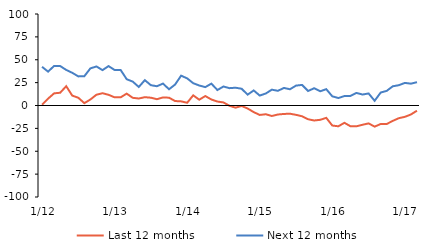
| Category | Last 12 months | Next 12 months |
|---|---|---|
|  1/12 | 0.85 | 42.3 |
|  2/12 | 7.49 | 37.02 |
|  3/12 | 13.29 | 43.26 |
|  4/12 | 13.96 | 43.14 |
|  5/12 | 21.08 | 38.87 |
|  6/12 | 10.81 | 35.74 |
|  7/12 | 8.46 | 31.81 |
|  8/12 | 2.55 | 32.03 |
|  9/12 | 6.58 | 40.6 |
|  10/12 | 11.79 | 42.65 |
|  11/12 | 13.41 | 38.66 |
|  12/12 | 11.71 | 43.07 |
|  1/13 | 8.92 | 38.82 |
|  2/13 | 8.92 | 38.82 |
|  3/13 | 12.98 | 28.75 |
|  4/13 | 8.4 | 26.12 |
|  5/13 | 7.64 | 20.26 |
|  6/13 | 9.1 | 27.71 |
|  7/13 | 8.51 | 22.2 |
|  8/13 | 6.89 | 21.06 |
|  9/13 | 8.81 | 23.95 |
|  10/13 | 8.54 | 17.76 |
|  11/13 | 4.88 | 22.87 |
|  12/13 | 4.53 | 32.62 |
|  1/14 | 2.99 | 29.64 |
|  2/14 | 11.1 | 24.37 |
|  3/14 | 6.35 | 21.86 |
|  4/14 | 10.34 | 20.09 |
|  5/14 | 6.57 | 23.91 |
|  6/14 | 4.33 | 16.91 |
|  7/14 | 3.35 | 20.75 |
|  8/14 | -0.33 | 18.95 |
|  9/14 | -2.37 | 19.44 |
|  10/14 | -0.5 | 18.32 |
|  11/14 | -3.3 | 11.85 |
|  12/14 | -7.21 | 16.46 |
|  1/15 | -10.32 | 10.88 |
|  2/15 | -9.55 | 13.1 |
|  3/15 | -11.45 | 17.32 |
|  4/15 | -9.85 | 16.04 |
|  5/15 | -9.22 | 19.19 |
|  6/15 | -8.99 | 17.77 |
|  7/15 | -10.2 | 21.74 |
|  8/15 | -11.76 | 22.49 |
|  9/15 | -15.03 | 15.86 |
|  10/15 | -16.38 | 18.89 |
|  11/15 | -15.64 | 15.55 |
|  12/15 | -13.49 | 17.84 |
|  1/16 | -21.91 | 10.03 |
|  2/16 | -22.72 | 8.16 |
|  3/16 | -18.91 | 10.34 |
|  4/16 | -22.65 | 10.48 |
|  5/16 | -22.69 | 13.73 |
|  6/16 | -21.05 | 11.99 |
|  7/16 | -19.56 | 13.15 |
|  8/16 | -23.1 | 5.15 |
|  9/16 | -20.21 | 14.17 |
|  10/16 | -20.19 | 16 |
|  11/16 | -16.81 | 20.99 |
|  12/16 | -13.84 | 22.19 |
|  1/17 | -12.4 | 24.7 |
|  2/17 | -9.79 | 23.87 |
|  3/17 | -5.67 | 25.48 |